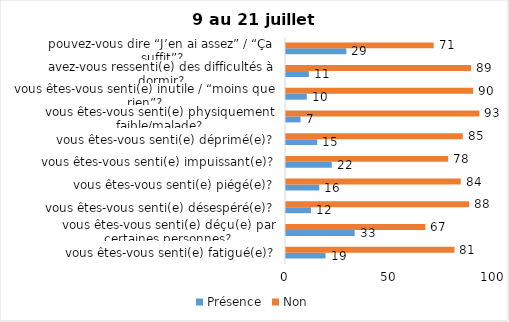
| Category | Présence | Non |
|---|---|---|
| vous êtes-vous senti(e) fatigué(e)? | 19 | 81 |
| vous êtes-vous senti(e) déçu(e) par certaines personnes? | 33 | 67 |
| vous êtes-vous senti(e) désespéré(e)? | 12 | 88 |
| vous êtes-vous senti(e) piégé(e)? | 16 | 84 |
| vous êtes-vous senti(e) impuissant(e)? | 22 | 78 |
| vous êtes-vous senti(e) déprimé(e)? | 15 | 85 |
| vous êtes-vous senti(e) physiquement faible/malade? | 7 | 93 |
| vous êtes-vous senti(e) inutile / “moins que rien”? | 10 | 90 |
| avez-vous ressenti(e) des difficultés à dormir? | 11 | 89 |
| pouvez-vous dire “J’en ai assez” / “Ça suffit”? | 29 | 71 |